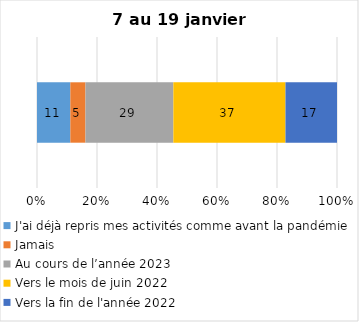
| Category | J'ai déjà repris mes activités comme avant la pandémie | Jamais | Au cours de l’année 2023 | Vers le mois de juin 2022 | Vers la fin de l'année 2022 |
|---|---|---|---|---|---|
| 0 | 11 | 5 | 29 | 37 | 17 |